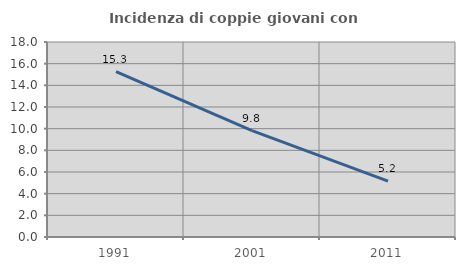
| Category | Incidenza di coppie giovani con figli |
|---|---|
| 1991.0 | 15.262 |
| 2001.0 | 9.826 |
| 2011.0 | 5.161 |